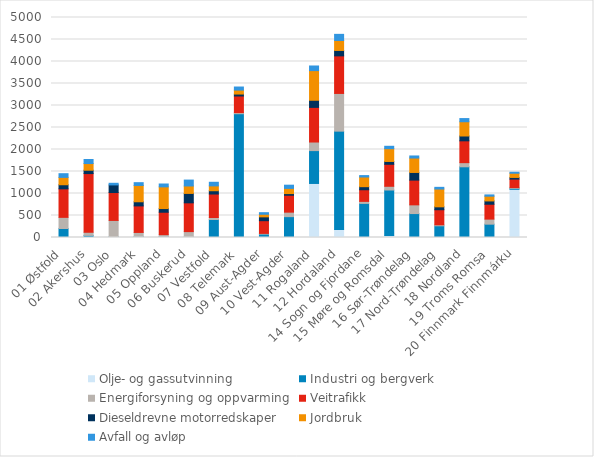
| Category | Olje- og gassutvinning | Industri og bergverk | Energiforsyning og oppvarming | Veitrafikk | Dieseldrevne motorredskaper | Jordbruk | Avfall og avløp |
|---|---|---|---|---|---|---|---|
| 01 Østfold | 0 | 204 | 254 | 648 | 93 | 167 | 84 |
| 02 Akershus | 0 | 48 | 71 | 1334 | 76 | 152 | 92 |
| 03 Oslo | 0 | 16 | 372 | 634 | 173 | 0 | 37 |
| 04 Hedmark | 0 | 24 | 91 | 603 | 94 | 371 | 63 |
| 05 Oppland | 0 | 25 | 40 | 509 | 84 | 493 | 65 |
| 06 Buskerud | 0 | 12 | 122 | 654 | 214 | 169 | 134 |
| 07 Vestfold | 0 | 409 | 46 | 533 | 75 | 110 | 82 |
| 08 Telemark | 0 | 2813 | 26 | 377 | 44 | 90 | 70 |
| 09 Aust-Agder | 0 | 77 | 16 | 289 | 87 | 59 | 36 |
| 10 Vest-Agder | 0 | 474 | 102 | 384 | 38 | 118 | 73 |
| 11 Rogaland | 1228 | 747 | 195 | 787 | 162 | 674 | 105 |
| 12 Hordaland | 182 | 2235 | 857 | 854 | 123 | 227 | 139 |
| 14 Sogn og Fjordane | 0 | 775 | 46 | 264 | 70 | 220 | 32 |
| 15 Møre og Romsdal | 44 | 1035 | 85 | 500 | 64 | 291 | 54 |
| 16 Sør-Trøndelag | 0 | 544 | 198 | 562 | 174 | 328 | 47 |
| 17 Nord-Trøndelag | 0 | 266 | 23 | 342 | 66 | 405 | 38 |
| 18 Nordland | 0 | 1607 | 94 | 496 | 110 | 324 | 72 |
| 19 Troms Romsa | 0 | 303 | 115 | 338 | 75 | 108 | 29 |
| 20 Finnmark Finnmárku | 1095 | 22 | 17 | 193 | 38 | 96 | 22 |